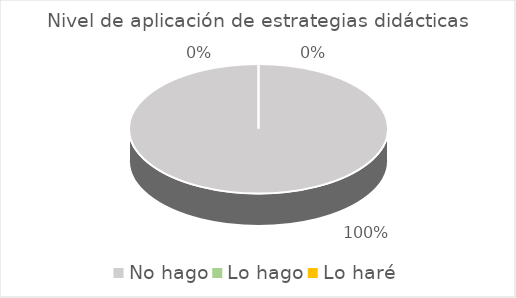
| Category | Series 0 |
|---|---|
| No hago | 48 |
| Lo hago | 0 |
| Lo haré | 0 |